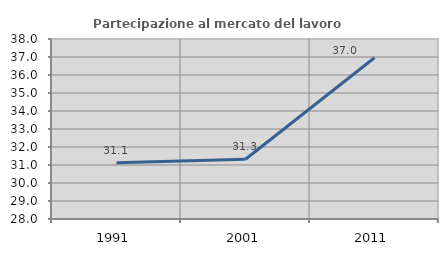
| Category | Partecipazione al mercato del lavoro  femminile |
|---|---|
| 1991.0 | 31.122 |
| 2001.0 | 31.319 |
| 2011.0 | 36.957 |